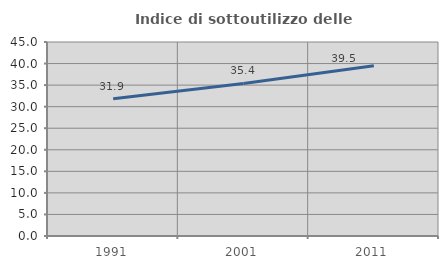
| Category | Indice di sottoutilizzo delle abitazioni  |
|---|---|
| 1991.0 | 31.859 |
| 2001.0 | 35.383 |
| 2011.0 | 39.493 |